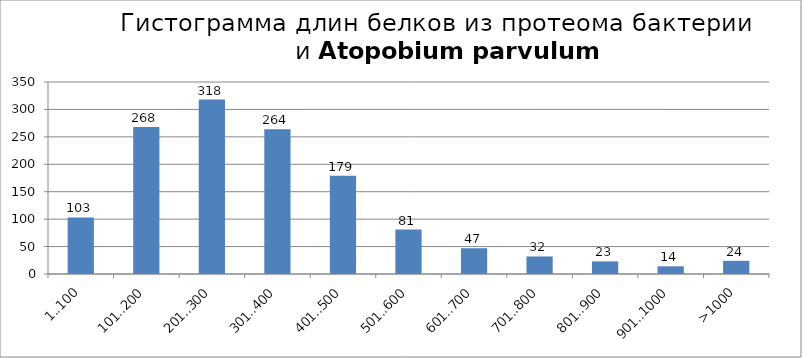
| Category | Series 0 |
|---|---|
| 1..100 | 103 |
| 101..200 | 268 |
| 201..300 | 318 |
| 301..400 | 264 |
| 401..500 | 179 |
| 501..600 | 81 |
| 601..700 | 47 |
| 701..800 | 32 |
| 801..900 | 23 |
| 901..1000 | 14 |
| >1000 | 24 |